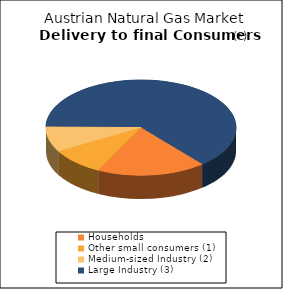
| Category | Series 0 |
|---|---|
| Households | 17595.566 |
| Other small consumers (1) | 8856.406 |
| Medium-sized Industry (2) | 8073.733 |
| Large Industry (3) | 60664.31 |